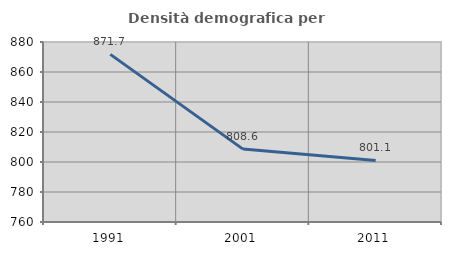
| Category | Densità demografica |
|---|---|
| 1991.0 | 871.733 |
| 2001.0 | 808.593 |
| 2011.0 | 801.073 |